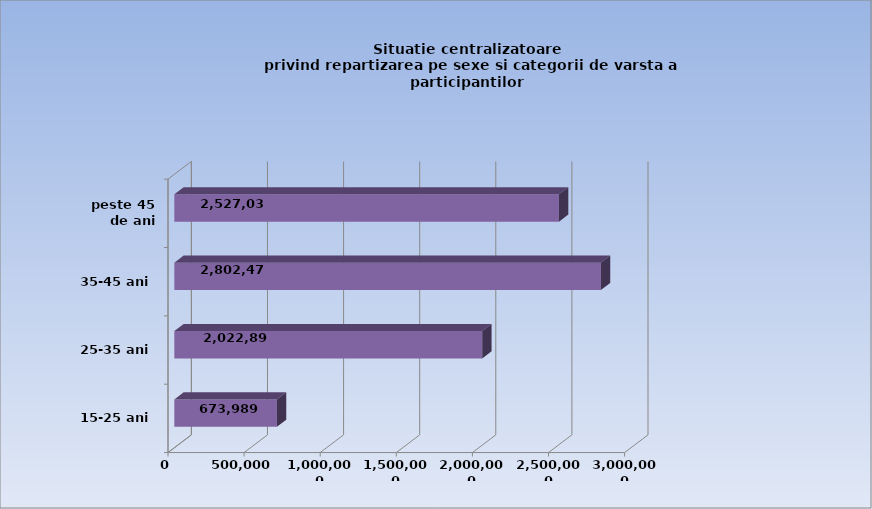
| Category | 15-25 ani 25-35 ani 35-45 ani peste 45 de ani |
|---|---|
| 15-25 ani | 673989 |
| 25-35 ani | 2022895 |
| 35-45 ani | 2802474 |
| peste 45 de ani | 2527039 |